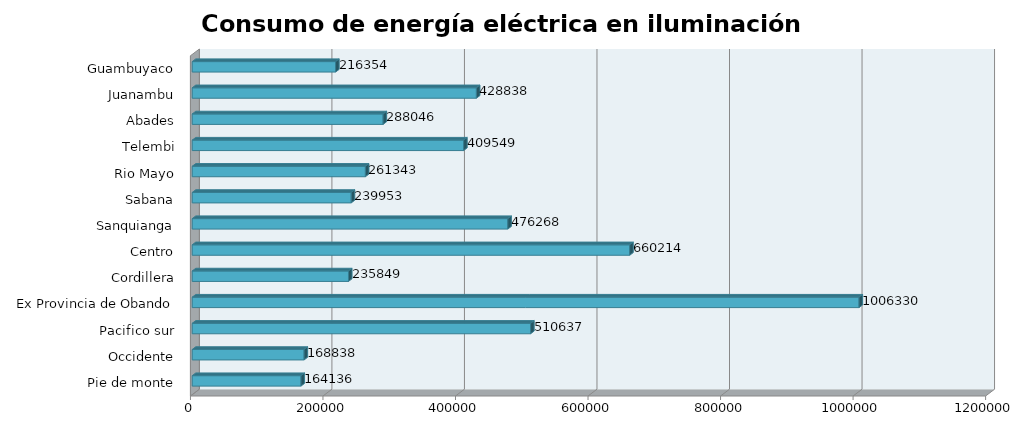
| Category | Series 0 |
|---|---|
| Pie de monte | 164136.068 |
| Occidente | 168838.397 |
| Pacifico sur | 510637.137 |
| Ex Provincia de Obando | 1006330.493 |
| Cordillera | 235848.767 |
| Centro | 660213.926 |
| Sanquianga | 476268.193 |
| Sabana | 239953.158 |
| Rio Mayo | 261342.976 |
| Telembi | 409549.314 |
| Abades | 288045.657 |
| Juanambu | 428838.231 |
| Guambuyaco | 216354.458 |